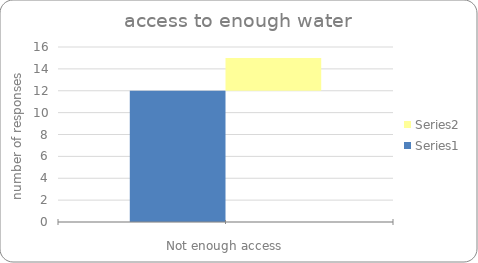
| Category | Series 0 | Series 1 |
|---|---|---|
|  | 12 | 3 |